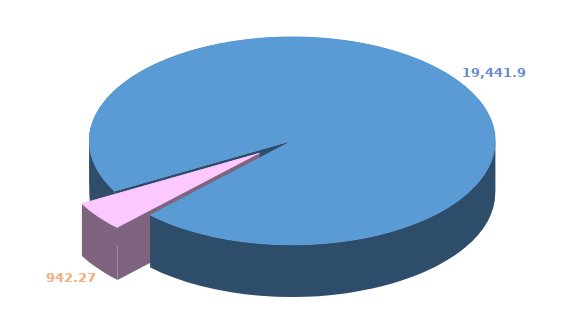
| Category | Series 0 |
|---|---|
| 0 | 19441.941 |
| 1 | 942.272 |